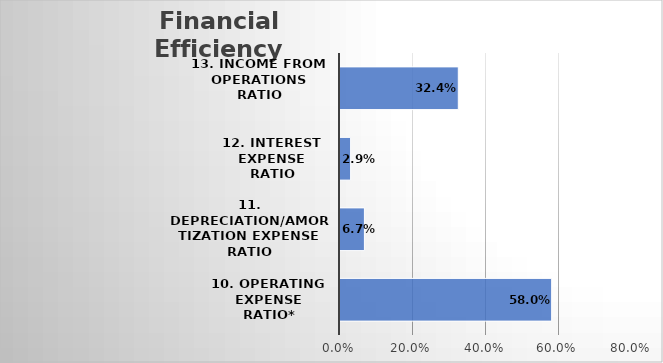
| Category | Series 0 |
|---|---|
| 10. Operating Expense Ratio* | 0.58 |
| 11. Depreciation/Amortization Expense Ratio | 0.067 |
| 12. Interest Expense Ratio | 0.029 |
| 13. Income from Operations Ratio | 0.324 |